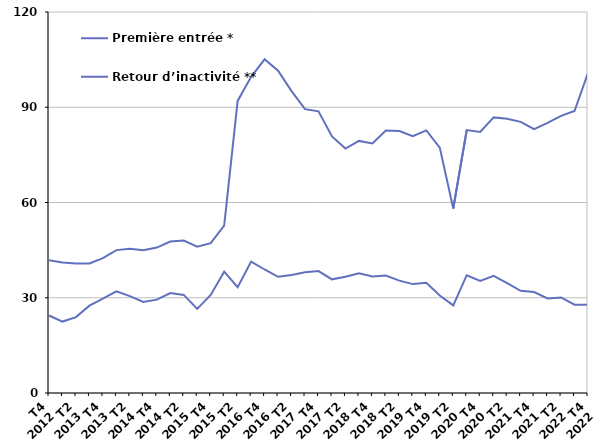
| Category | Première entrée * | Retour d’inactivité ** |
|---|---|---|
| T4
2012 | 24.4 | 41.8 |
| T1
2013 | 22.5 | 41.1 |
| T2
2013 | 23.9 | 40.8 |
| T3
2013 | 27.5 | 40.8 |
| T4
2013 | 29.7 | 42.5 |
| T1
2014 | 32 | 45 |
| T2
2014 | 30.5 | 45.4 |
| T3
2014 | 28.7 | 45 |
| T4
2014 | 29.4 | 45.8 |
| T1
2015 | 31.5 | 47.7 |
| T2
2015 | 30.9 | 48 |
| T3
2015 | 26.5 | 46.1 |
| T4
2015 | 30.9 | 47.2 |
| T1
2016 | 38.2 | 52.7 |
| T2
2016 | 33.3 | 92 |
| T3
2016 | 41.4 | 99.6 |
| T4
2016 | 38.9 | 105.1 |
| T1
2017 | 36.6 | 101.5 |
| T2
2017 | 37.2 | 95.1 |
| T3
2017 | 38 | 89.4 |
| T4
2017 | 38.4 | 88.7 |
| T1
2018 | 35.8 | 80.8 |
| T2
2018 | 36.6 | 77 |
| T3
2018 | 37.7 | 79.4 |
| T4
2018 | 36.7 | 78.6 |
| T1
2019 | 37 | 82.7 |
| T2
2019 | 35.4 | 82.5 |
| T3
2019 | 34.3 | 80.9 |
| T4
2019 | 34.7 | 82.7 |
| T1
2020 | 30.7 | 77.3 |
| T2
2020 | 27.6 | 58.1 |
| T3
2020 | 37.1 | 82.8 |
| T4
2020 | 35.3 | 82.2 |
| T1
2021 | 36.9 | 86.8 |
| T2
2021 | 34.6 | 86.4 |
| T3
2021 | 32.2 | 85.4 |
| T4
2021 | 31.8 | 83.1 |
| T1
2022 | 29.8 | 85.1 |
| T2
2022 | 30.1 | 87.3 |
| T3
2022 | 27.8 | 88.8 |
| T4
2022 | 27.8 | 100.8 |